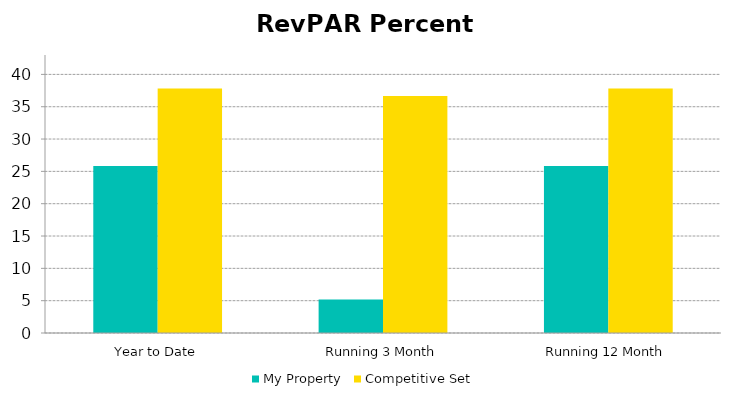
| Category | My Property | Competitive Set |
|---|---|---|
| Year to Date | 25.844 | 37.812 |
| Running 3 Month | 5.168 | 36.646 |
| Running 12 Month | 25.844 | 37.812 |